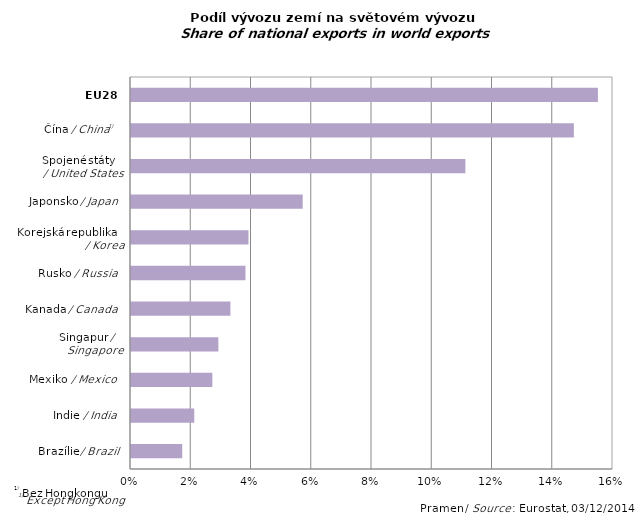
| Category | Series 0 |
|---|---|
|  | 0.017 |
|  | 0.021 |
|  | 0.027 |
|  | 0.029 |
|  | 0.033 |
|  | 0.038 |
|  | 0.039 |
|  | 0.057 |
|  | 0.111 |
|  | 0.147 |
|  | 0.155 |